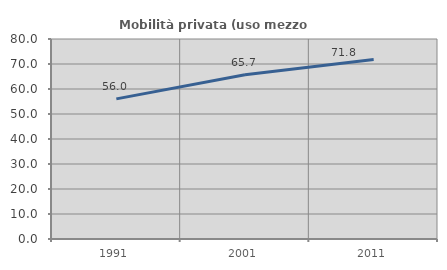
| Category | Mobilità privata (uso mezzo privato) |
|---|---|
| 1991.0 | 56.041 |
| 2001.0 | 65.688 |
| 2011.0 | 71.787 |